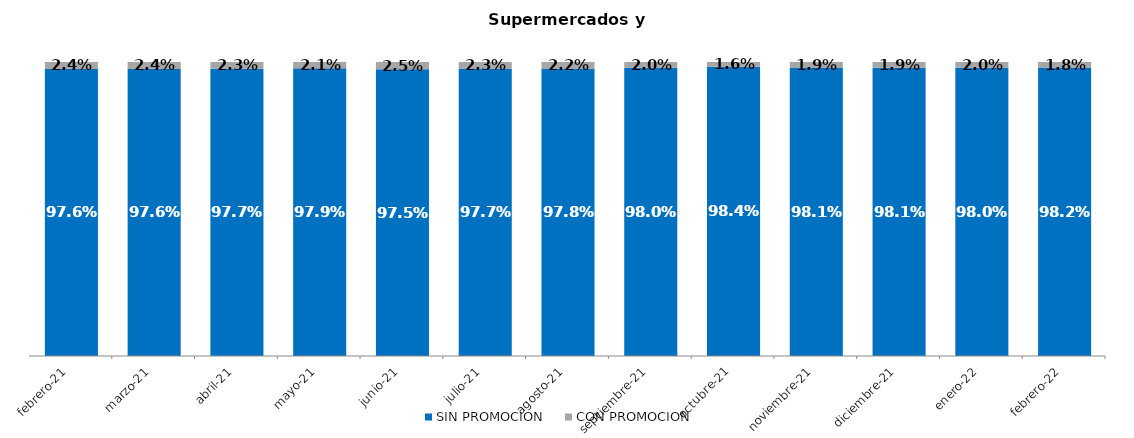
| Category | SIN PROMOCION   | CON PROMOCION   |
|---|---|---|
| 2021-02-01 | 0.976 | 0.024 |
| 2021-03-01 | 0.976 | 0.024 |
| 2021-04-01 | 0.977 | 0.023 |
| 2021-05-01 | 0.979 | 0.021 |
| 2021-06-01 | 0.975 | 0.025 |
| 2021-07-01 | 0.977 | 0.023 |
| 2021-08-01 | 0.978 | 0.022 |
| 2021-09-01 | 0.98 | 0.02 |
| 2021-10-01 | 0.984 | 0.016 |
| 2021-11-01 | 0.981 | 0.019 |
| 2021-12-01 | 0.981 | 0.019 |
| 2022-01-01 | 0.98 | 0.02 |
| 2022-02-01 | 0.982 | 0.018 |